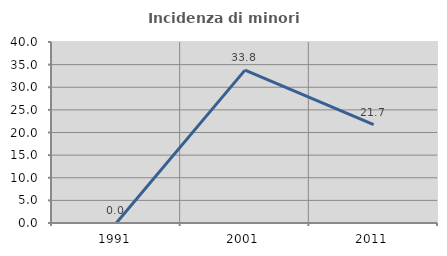
| Category | Incidenza di minori stranieri |
|---|---|
| 1991.0 | 0 |
| 2001.0 | 33.784 |
| 2011.0 | 21.739 |